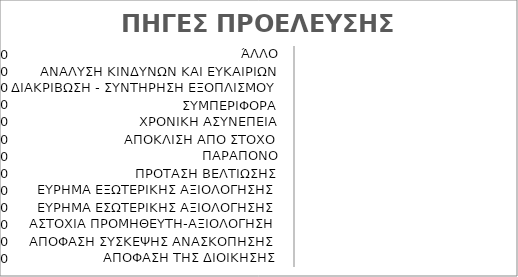
| Category | Series 0 | ΠΟΣΟΣΤΟ % |
|---|---|---|
| ΑΠΟΦΑΣΗ ΤΗΣ ΔΙΟΙΚΗΣΗΣ |  | 0 |
| ΑΠΟΦΑΣΗ ΣΥΣΚΕΨΗΣ ΑΝΑΣΚΟΠΗΣΗΣ |  | 0 |
| ΑΣΤΟΧΙΑ ΠΡΟΜΗΘΕΥΤΗ-ΑΞΙΟΛΟΓΗΣΗ |  | 0 |
| ΕΥΡΗΜΑ ΕΣΩΤΕΡΙΚΗΣ ΑΞΙΟΛΟΓΗΣΗΣ |  | 0 |
| ΕΥΡΗΜΑ ΕΞΩΤΕΡΙΚΗΣ ΑΞΙΟΛΟΓΗΣΗΣ |  | 0 |
| ΠΡΟΤΑΣΗ ΒΕΛΤΙΩΣΗΣ |  | 0 |
| ΠΑΡΑΠΟΝΟ |  | 0 |
| ΑΠΟΚΛΙΣΗ ΑΠΟ ΣΤΟΧΟ |  | 0 |
| ΧΡΟΝΙΚΗ ΑΣΥΝΕΠΕΙΑ |  | 0 |
| ΣΥΜΠΕΡΙΦΟΡΑ |  | 0 |
| ΔΙΑΚΡΙΒΩΣΗ - ΣΥΝΤΗΡΗΣΗ ΕΞΟΠΛΙΣΜΟΥ |  | 0 |
| ΑΝΑΛΥΣΗ ΚΙΝΔΥΝΩΝ ΚΑΙ ΕΥΚΑΙΡΙΩΝ |  | 0 |
| ΆΛΛΟ |  | 0 |